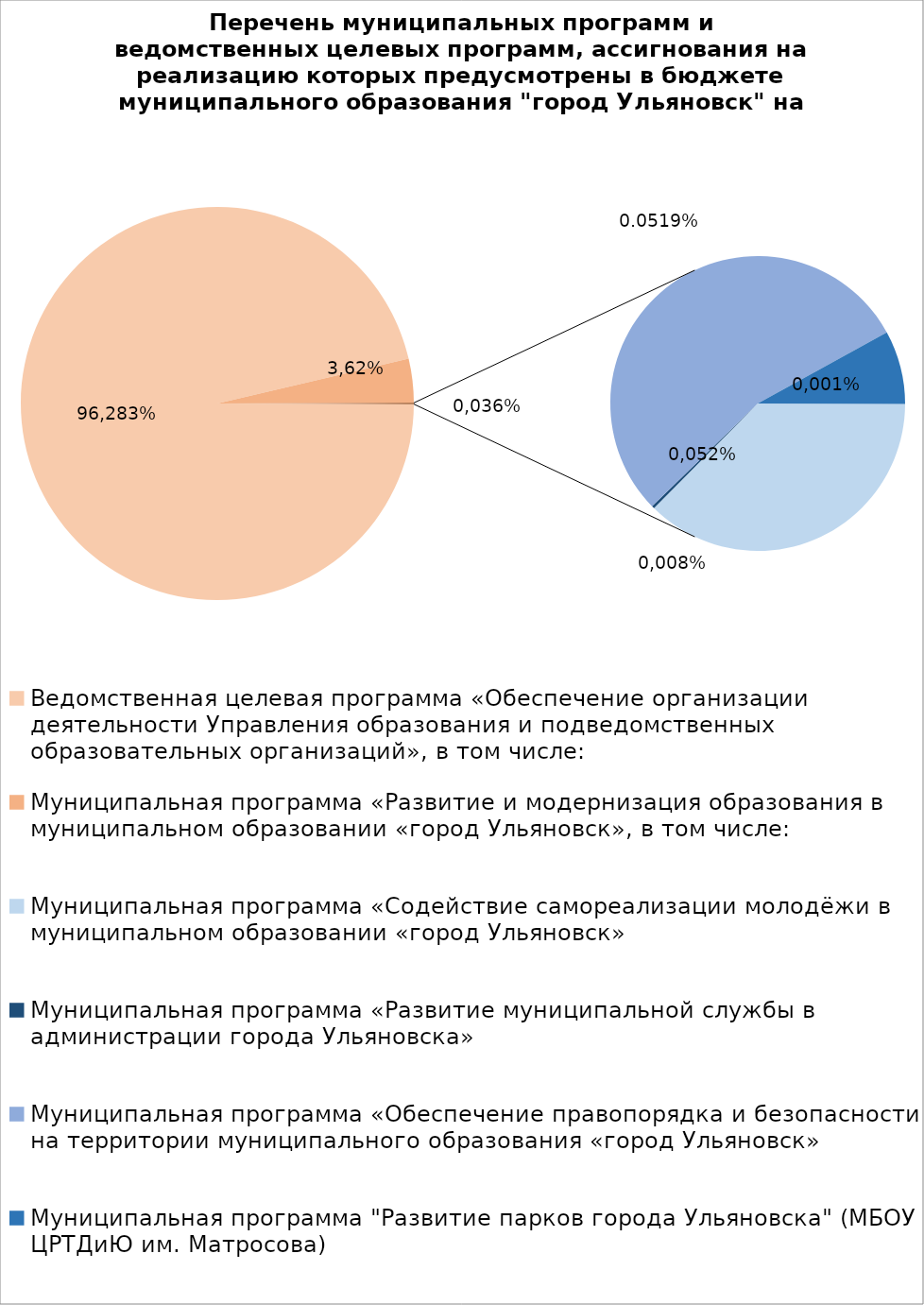
| Category | Series 0 |
|---|---|
| Ведомственная целевая программа «Обеспечение организации деятельности Управления образования и подведомственных образовательных организаций», в том числе: | 4990055.64 |
| Муниципальная программа «Развитие и модернизация образования в муниципальном образовании «город Ульяновск», в том числе: | 187500.8 |
| Муниципальная программа «Содействие самореализации молодёжи в муниципальном образовании «город Ульяновск» | 1853.16 |
| Муниципальная программа «Развитие муниципальной службы в администрации города Ульяновска» | 15.4 |
| Муниципальная программа «Обеспечение правопорядка и безопасности на территории муниципального образования «город Ульяновск» | 2690 |
| Муниципальная программа "Развитие парков города Ульяновска" (МБОУ ЦРТДиЮ им. Матросова) | 400 |